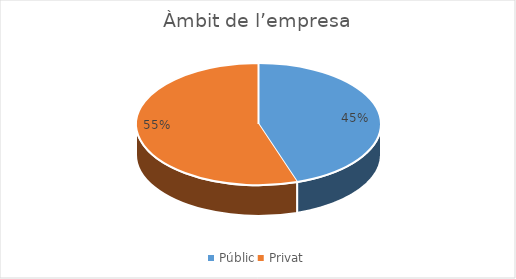
| Category | Series 0 |
|---|---|
| Públic | 22 |
| Privat | 27 |